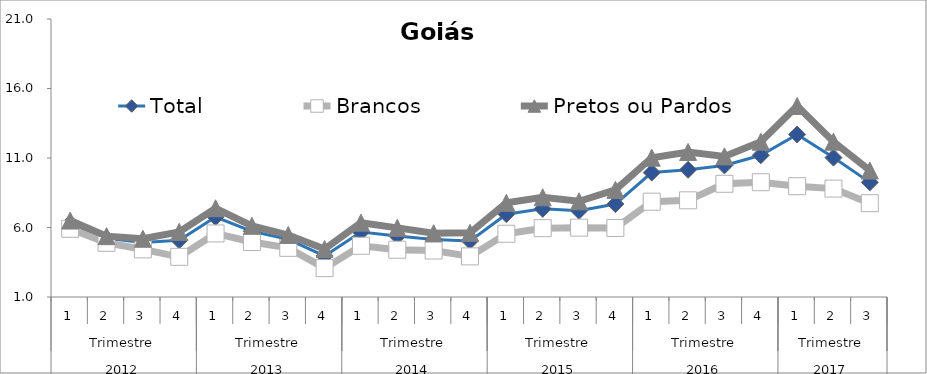
| Category | Total | Brancos | Pretos ou Pardos |
|---|---|---|---|
| 0 | 6.299 | 5.906 | 6.499 |
| 1 | 5.221 | 4.9 | 5.377 |
| 2 | 4.918 | 4.428 | 5.191 |
| 3 | 5.083 | 3.89 | 5.683 |
| 4 | 6.753 | 5.573 | 7.384 |
| 5 | 5.728 | 4.959 | 6.12 |
| 6 | 5.147 | 4.537 | 5.459 |
| 7 | 3.955 | 3.078 | 4.443 |
| 8 | 5.673 | 4.687 | 6.348 |
| 9 | 5.385 | 4.402 | 5.974 |
| 10 | 5.143 | 4.345 | 5.589 |
| 11 | 5.031 | 3.923 | 5.615 |
| 12 | 6.959 | 5.549 | 7.773 |
| 13 | 7.341 | 5.952 | 8.173 |
| 14 | 7.2 | 5.99 | 7.884 |
| 15 | 7.687 | 5.965 | 8.705 |
| 16 | 9.951 | 7.858 | 11.023 |
| 17 | 10.155 | 7.955 | 11.434 |
| 18 | 10.467 | 9.145 | 11.116 |
| 19 | 11.196 | 9.259 | 12.17 |
| 20 | 12.689 | 8.972 | 14.743 |
| 21 | 11.028 | 8.798 | 12.177 |
| 22 | 9.247 | 7.751 | 10.1 |